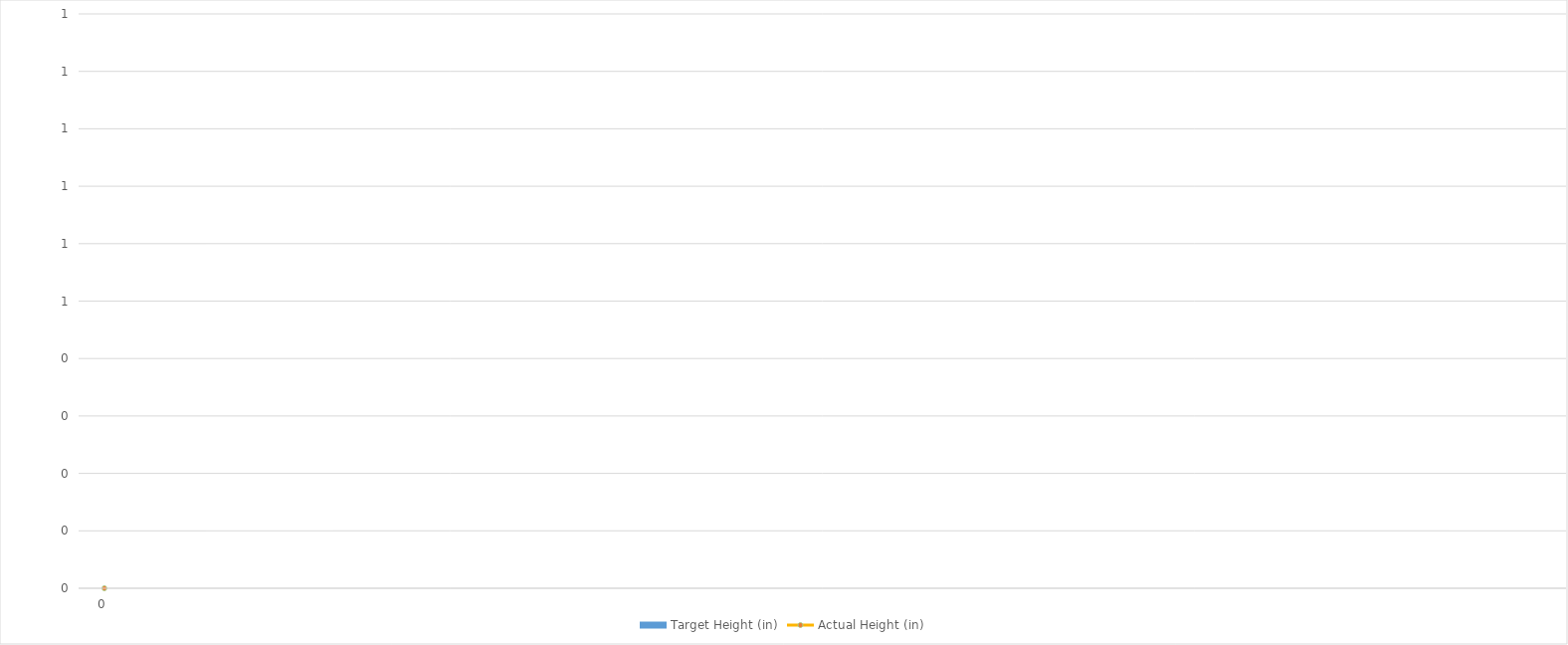
| Category | Actual Height (in) |
|---|---|
| 0 | 0 |